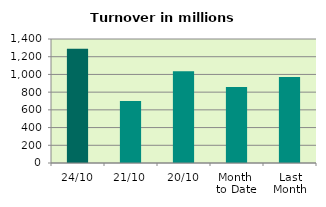
| Category | Series 0 |
|---|---|
| 24/10 | 1290.387 |
| 21/10 | 701.29 |
| 20/10 | 1035.389 |
| Month 
to Date | 856.789 |
| Last
Month | 970.98 |